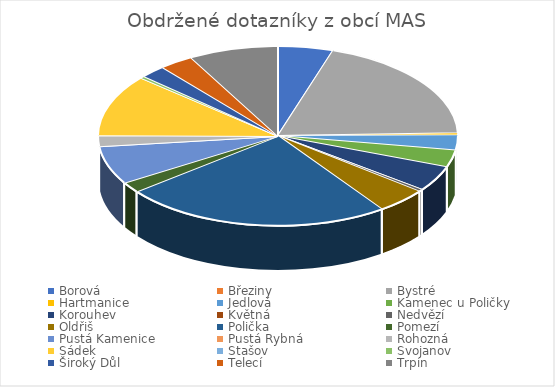
| Category | Series 0 |
|---|---|
| Borová | 13 |
| Březiny | 0 |
| Bystré | 51 |
| Hartmanice | 1 |
| Jedlová | 7 |
| Kamenec u Poličky | 8 |
| Korouhev | 12 |
| Květná | 0 |
| Nedvězí | 1 |
| Oldřiš | 12 |
| Polička | 63 |
| Pomezí | 5 |
| Pustá Kamenice | 18 |
| Pustá Rybná | 0 |
| Rohozná | 5 |
| Sádek | 29 |
| Stašov | 0 |
| Svojanov | 1 |
| Široký Důl | 6 |
| Telecí | 8 |
| Trpín | 21 |